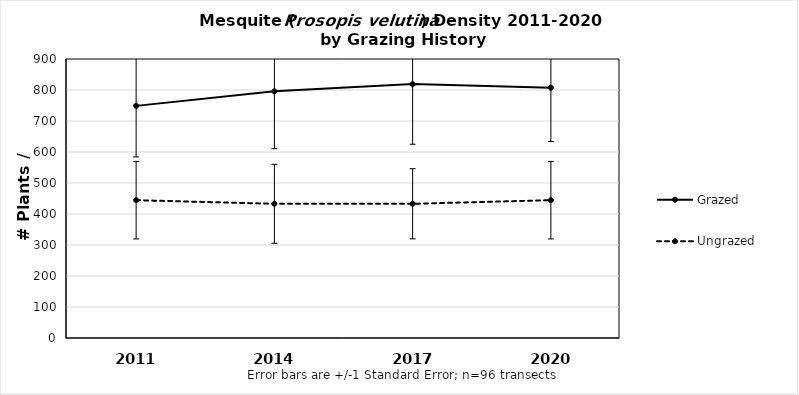
| Category | Grazed | Ungrazed |
|---|---|---|
| 2011.0 | 748.793 | 444.596 |
| 2014.0 | 795.593 | 432.896 |
| 2017.0 | 818.992 | 432.896 |
| 2020.0 | 807.292 | 444.596 |